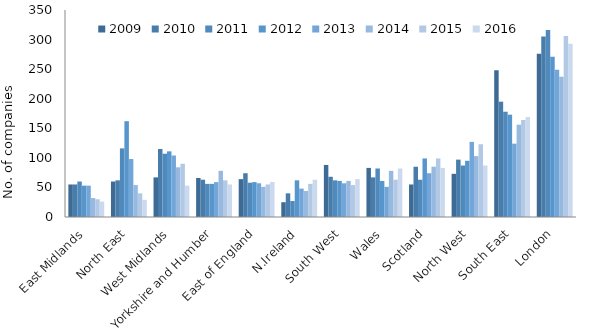
| Category | 2009 | 2010 | 2011 | 2012 | 2013 | 2014 | 2015 | 2016 |
|---|---|---|---|---|---|---|---|---|
| East Midlands | 55 | 55 | 60 | 53 | 53 | 32 | 30 | 26 |
| North East | 60 | 62 | 116 | 162 | 98 | 54 | 40 | 29 |
| West Midlands | 67 | 115 | 107 | 111 | 104 | 84 | 90 | 53 |
| Yorkshire and Humber | 66 | 63 | 56 | 56 | 59 | 78 | 62 | 55 |
| East of England | 64 | 74 | 58 | 59 | 57 | 51 | 55 | 59 |
| N.Ireland | 25 | 40 | 27 | 62 | 48 | 44 | 56 | 63 |
| South West | 88 | 68 | 62 | 61 | 57 | 61 | 54 | 64 |
| Wales | 83 | 67 | 82 | 61 | 51 | 78 | 63 | 82 |
| Scotland | 55 | 85 | 63 | 99 | 74 | 85 | 99 | 83 |
| North West | 73 | 97 | 87 | 95 | 127 | 103 | 123 | 87 |
| South East | 248 | 195 | 178 | 173 | 124 | 156 | 164 | 169 |
| London | 276 | 305 | 316 | 271 | 249 | 237 | 306 | 293 |